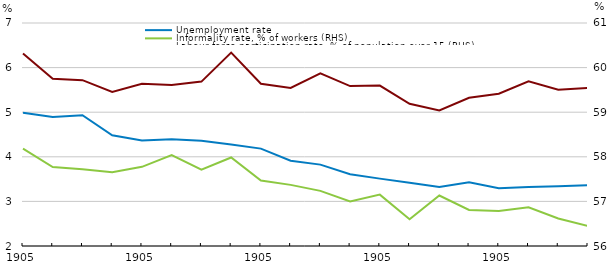
| Category | Unemployment rate |
|---|---|
| 2014 | 4.989 |
|  | 4.891 |
|  | 4.933 |
|  | 4.483 |
| 2015 | 4.366 |
|  | 4.392 |
|  | 4.361 |
|  | 4.276 |
| 2016 | 4.184 |
|  | 3.912 |
|  | 3.825 |
|  | 3.609 |
| 2017 | 3.51 |
|  | 3.418 |
|  | 3.325 |
|  | 3.427 |
| 2018 | 3.296 |